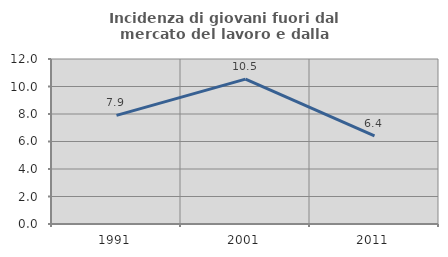
| Category | Incidenza di giovani fuori dal mercato del lavoro e dalla formazione  |
|---|---|
| 1991.0 | 7.898 |
| 2001.0 | 10.536 |
| 2011.0 | 6.404 |